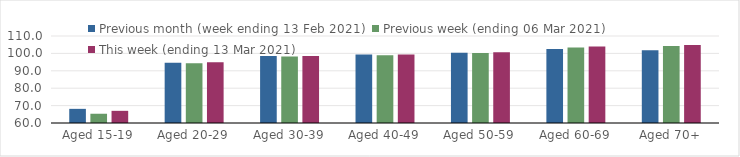
| Category | Previous month (week ending 13 Feb 2021) | Previous week (ending 06 Mar 2021) | This week (ending 13 Mar 2021) |
|---|---|---|---|
| Aged 15-19 | 68.13 | 65.32 | 66.99 |
| Aged 20-29 | 94.56 | 94.33 | 94.9 |
| Aged 30-39 | 98.57 | 98.2 | 98.47 |
| Aged 40-49 | 99.4 | 98.94 | 99.34 |
| Aged 50-59 | 100.44 | 100.17 | 100.7 |
| Aged 60-69 | 102.57 | 103.43 | 104.02 |
| Aged 70+ | 101.82 | 104.29 | 104.77 |